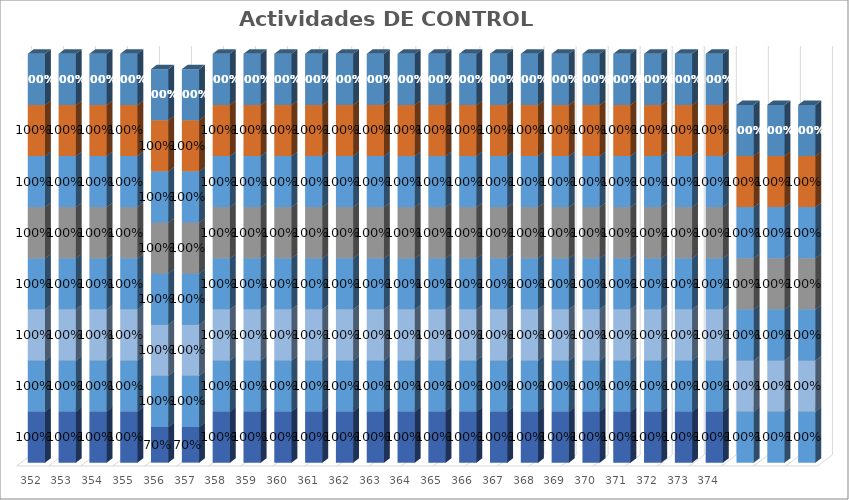
| Category | % Avance |
|---|---|
| 352.0 | 1 |
| 353.0 | 1 |
| 354.0 | 1 |
| 355.0 | 1 |
| 356.0 | 1 |
| 357.0 | 1 |
| 358.0 | 1 |
| 359.0 | 1 |
| 360.0 | 1 |
| 361.0 | 1 |
| 362.0 | 1 |
| 363.0 | 1 |
| 364.0 | 1 |
| 365.0 | 1 |
| 366.0 | 1 |
| 367.0 | 1 |
| 368.0 | 1 |
| 369.0 | 1 |
| 370.0 | 1 |
| 371.0 | 1 |
| 372.0 | 1 |
| 373.0 | 1 |
| 374.0 | 1 |